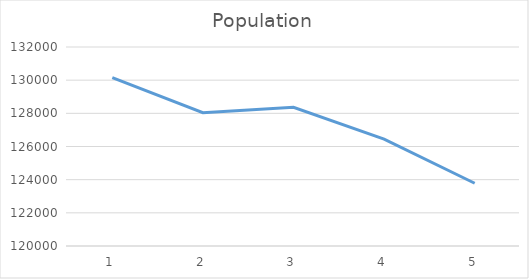
| Category | Series 0 |
|---|---|
| 0 | 130155 |
| 1 | 128035 |
| 2 | 128367 |
| 3 | 126448 |
| 4 | 123785 |